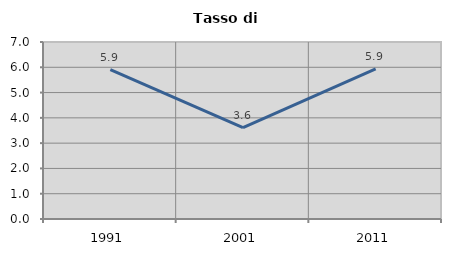
| Category | Tasso di disoccupazione   |
|---|---|
| 1991.0 | 5.906 |
| 2001.0 | 3.617 |
| 2011.0 | 5.936 |